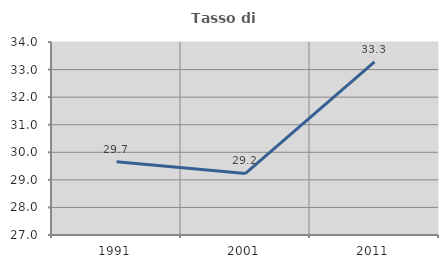
| Category | Tasso di occupazione   |
|---|---|
| 1991.0 | 29.657 |
| 2001.0 | 29.233 |
| 2011.0 | 33.282 |